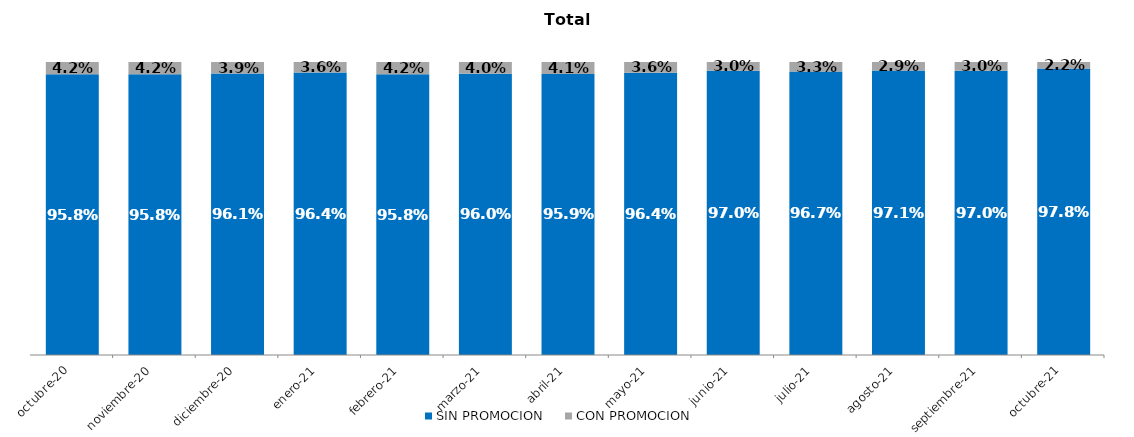
| Category | SIN PROMOCION   | CON PROMOCION   |
|---|---|---|
| 2020-10-01 | 0.958 | 0.042 |
| 2020-11-01 | 0.958 | 0.042 |
| 2020-12-01 | 0.961 | 0.039 |
| 2021-01-01 | 0.964 | 0.036 |
| 2021-02-01 | 0.958 | 0.042 |
| 2021-03-01 | 0.96 | 0.04 |
| 2021-04-01 | 0.959 | 0.041 |
| 2021-05-01 | 0.964 | 0.036 |
| 2021-06-01 | 0.97 | 0.03 |
| 2021-07-01 | 0.967 | 0.033 |
| 2021-08-01 | 0.971 | 0.029 |
| 2021-09-01 | 0.97 | 0.03 |
| 2021-10-01 | 0.978 | 0.022 |